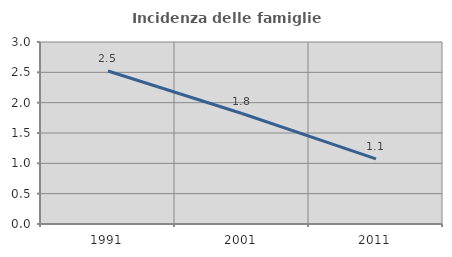
| Category | Incidenza delle famiglie numerose |
|---|---|
| 1991.0 | 2.521 |
| 2001.0 | 1.821 |
| 2011.0 | 1.074 |